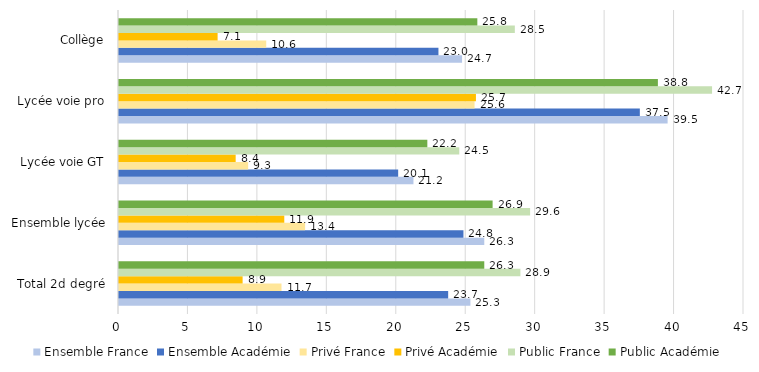
| Category | Ensemble France | Ensemble Académie | Privé France | Privé Académie | Public France | Public Académie |
|---|---|---|---|---|---|---|
| Total 2d degré | 25.3 | 23.7 | 11.7 | 8.9 | 28.9 | 26.3 |
| Ensemble lycée | 26.3 | 24.8 | 13.4 | 11.9 | 29.6 | 26.9 |
| Lycée voie GT | 21.2 | 20.1 | 9.3 | 8.4 | 24.5 | 22.2 |
| Lycée voie pro | 39.5 | 37.5 | 25.6 | 25.7 | 42.7 | 38.8 |
| Collège | 24.7 | 23 | 10.6 | 7.1 | 28.5 | 25.8 |